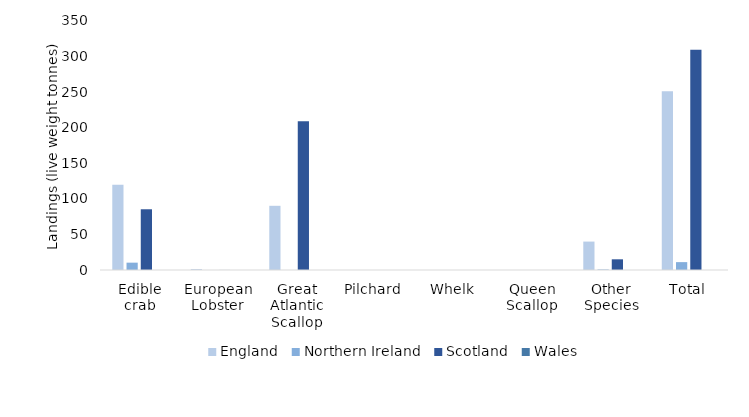
| Category | England | Northern Ireland | Scotland | Wales |
|---|---|---|---|---|
| Edible crab | 119.871 | 10.322 | 85.373 | 0 |
| European Lobster | 1.269 | 0.002 | 0.064 | 0 |
| Great Atlantic Scallop | 90.24 | 0 | 209.027 | 0 |
| Pilchard | 0 | 0 | 0 | 0 |
| Whelk | 0 | 0 | 0 | 0 |
| Queen Scallop | 0 | 0 | 0 | 0 |
| Other Species | 39.948 | 0.745 | 15.033 | 0 |
| Total | 251.328 | 11.069 | 309.497 | 0 |